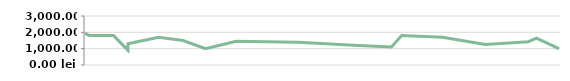
| Category | VENITURI |
|---|---|
| 2013-04-23 | 1950 |
| 2013-04-25 | 1800 |
| 2013-05-07 | 1800 |
| 2013-05-14 | 900 |
| 2013-05-14 | 1300 |
| 2013-05-29 | 1700 |
| 2013-06-10 | 1500 |
| 2013-06-21 | 1000 |
| 2013-07-06 | 1450 |
| 2013-08-05 | 1400 |
| 2013-08-19 | 1300 |
| 2013-09-04 | 1200 |
| 2013-09-20 | 1100 |
| 2013-09-25 | 1800 |
| 2013-10-15 | 1700 |
| 2013-11-05 | 1250 |
| 2013-11-26 | 1425 |
| 2013-11-30 | 1650 |
| 2013-12-11 | 1000 |